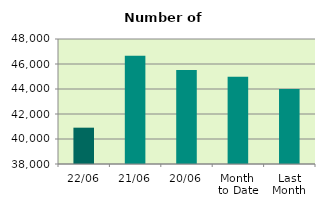
| Category | Series 0 |
|---|---|
| 22/06 | 40906 |
| 21/06 | 46656 |
| 20/06 | 45528 |
| Month 
to Date | 44971.5 |
| Last
Month | 44009.364 |